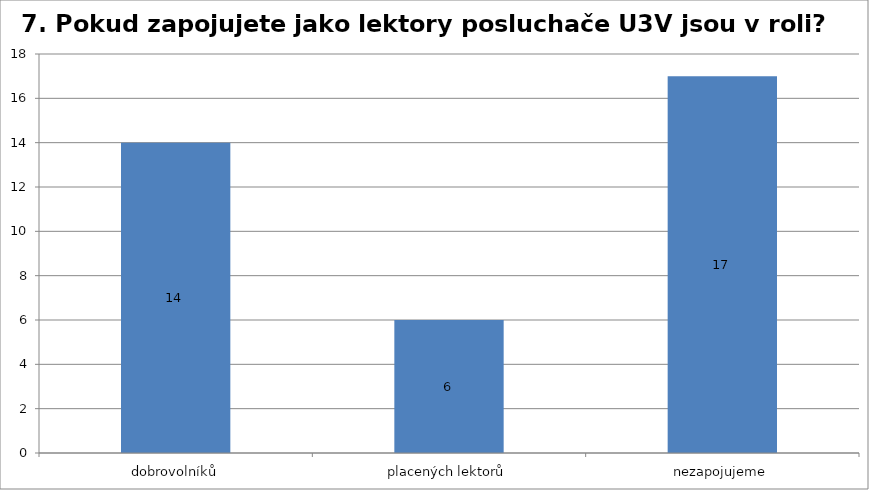
| Category | Series 0 |
|---|---|
| dobrovolníků | 14 |
| placených lektorů | 6 |
| nezapojujeme | 17 |